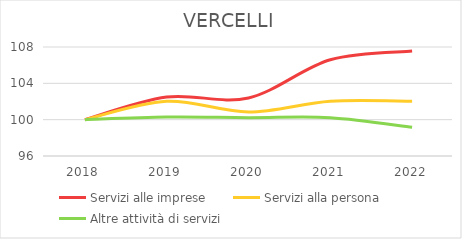
| Category | Servizi alle imprese | Servizi alla persona | Altre attività di servizi |
|---|---|---|---|
| 2018.0 | 100 | 100 | 100 |
| 2019.0 | 102.486 | 102.029 | 100.28 |
| 2020.0 | 102.39 | 100.845 | 100.224 |
| 2021.0 | 106.597 | 102.029 | 100.224 |
| 2022.0 | 107.553 | 102.029 | 99.16 |